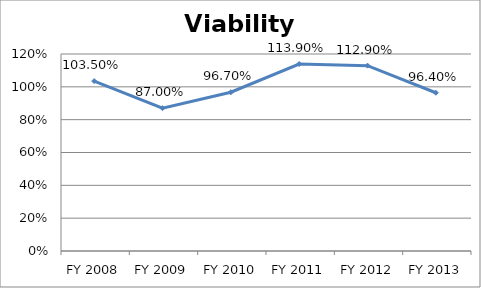
| Category | Viability ratio |
|---|---|
| FY 2013 | 0.964 |
| FY 2012 | 1.129 |
| FY 2011 | 1.139 |
| FY 2010 | 0.967 |
| FY 2009 | 0.87 |
| FY 2008 | 1.035 |